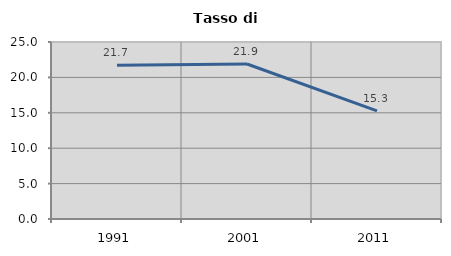
| Category | Tasso di disoccupazione   |
|---|---|
| 1991.0 | 21.715 |
| 2001.0 | 21.89 |
| 2011.0 | 15.283 |